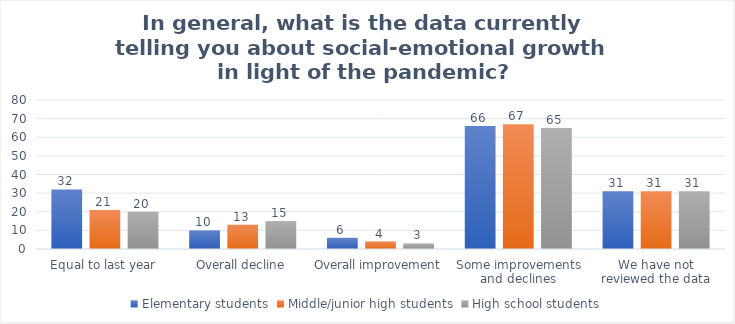
| Category | Elementary students | Middle/junior high students | High school students |
|---|---|---|---|
| Equal to last year | 32 | 21 | 20 |
| Overall decline | 10 | 13 | 15 |
| Overall improvement | 6 | 4 | 3 |
| Some improvements and declines | 66 | 67 | 65 |
| We have not reviewed the data | 31 | 31 | 31 |